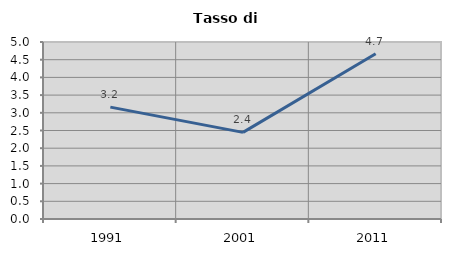
| Category | Tasso di disoccupazione   |
|---|---|
| 1991.0 | 3.161 |
| 2001.0 | 2.447 |
| 2011.0 | 4.666 |